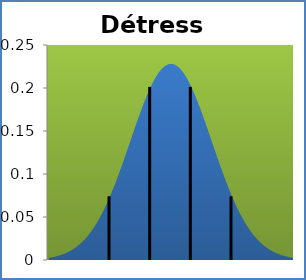
| Category | Series 1 |
|---|---|
| -2.2840000000000007 | 0.003 |
| -2.1965500000000002 | 0.003 |
| -2.1091000000000006 | 0.003 |
| -2.02165 | 0.004 |
| -1.9341999999999997 | 0.005 |
| -1.8467500000000001 | 0.005 |
| -1.7593000000000005 | 0.006 |
| -1.67185 | 0.007 |
| -1.5844000000000005 | 0.008 |
| -1.496950000000001 | 0.009 |
| -1.4095000000000004 | 0.01 |
| -1.32205 | 0.011 |
| -1.2345999999999995 | 0.013 |
| -1.14715 | 0.014 |
| -1.0597000000000003 | 0.016 |
| -0.9722499999999998 | 0.018 |
| -0.8848000000000003 | 0.02 |
| -0.7973500000000002 | 0.023 |
| -0.7098999999999998 | 0.025 |
| -0.6224500000000002 | 0.028 |
| -0.5350000000000001 | 0.031 |
| -0.44754999999999967 | 0.034 |
| -0.3601000000000001 | 0.038 |
| -0.2726500000000005 | 0.041 |
| -0.18520000000000003 | 0.045 |
| -0.09775 | 0.049 |
| -0.010299999999999976 | 0.054 |
| 0.07714999999999961 | 0.058 |
| 0.16460000000000008 | 0.063 |
| 0.2520500000000001 | 0.069 |
| 0.3394999999999997 | 0.074 |
| 0.4269499999999997 | 0.08 |
| 0.5144000000000002 | 0.086 |
| 0.6018499999999998 | 0.092 |
| 0.6892999999999998 | 0.098 |
| 0.7767499999999998 | 0.104 |
| 0.8642000000000003 | 0.111 |
| 0.9516499999999999 | 0.118 |
| 1.0391 | 0.125 |
| 1.1265500000000002 | 0.131 |
| 1.214 | 0.138 |
| 1.30145 | 0.145 |
| 1.3889 | 0.152 |
| 1.47635 | 0.159 |
| 1.5638 | 0.166 |
| 1.6512499999999999 | 0.172 |
| 1.7387000000000001 | 0.179 |
| 1.82615 | 0.185 |
| 1.9136000000000002 | 0.191 |
| 2.00105 | 0.196 |
| 2.0885 | 0.201 |
| 2.1759500000000003 | 0.206 |
| 2.2634 | 0.211 |
| 2.3508500000000003 | 0.215 |
| 2.4383 | 0.218 |
| 2.52575 | 0.221 |
| 2.6132 | 0.224 |
| 2.70065 | 0.226 |
| 2.7881 | 0.227 |
| 2.87555 | 0.228 |
| 2.963 | 0.228 |
| 3.05045 | 0.228 |
| 3.1379 | 0.227 |
| 3.22535 | 0.226 |
| 3.3128 | 0.224 |
| 3.40025 | 0.221 |
| 3.4877000000000002 | 0.218 |
| 3.57515 | 0.215 |
| 3.6626000000000003 | 0.211 |
| 3.75005 | 0.206 |
| 3.8375000000000004 | 0.201 |
| 3.92495 | 0.196 |
| 4.0123999999999995 | 0.191 |
| 4.09985 | 0.185 |
| 4.1873000000000005 | 0.179 |
| 4.27475 | 0.172 |
| 4.3622 | 0.166 |
| 4.44965 | 0.159 |
| 4.537100000000001 | 0.152 |
| 4.62455 | 0.145 |
| 4.712 | 0.138 |
| 4.79945 | 0.131 |
| 4.886900000000001 | 0.125 |
| 4.97435 | 0.118 |
| 5.0618 | 0.111 |
| 5.14925 | 0.104 |
| 5.236700000000001 | 0.098 |
| 5.32415 | 0.092 |
| 5.4116 | 0.086 |
| 5.49905 | 0.08 |
| 5.586500000000001 | 0.074 |
| 5.67395 | 0.069 |
| 5.7614 | 0.063 |
| 5.8488500000000005 | 0.058 |
| 5.9363 | 0.054 |
| 6.02375 | 0.049 |
| 6.1112 | 0.045 |
| 6.198650000000001 | 0.041 |
| 6.2861 | 0.038 |
| 6.37355 | 0.034 |
| 6.461 | 0.031 |
| 6.548450000000001 | 0.028 |
| 6.6358999999999995 | 0.025 |
| 6.72335 | 0.023 |
| 6.8108 | 0.02 |
| 6.89825 | 0.018 |
| 6.9857000000000005 | 0.016 |
| 7.07315 | 0.014 |
| 7.1606 | 0.013 |
| 7.24805 | 0.011 |
| 7.335500000000001 | 0.01 |
| 7.422950000000001 | 0.009 |
| 7.510400000000001 | 0.008 |
| 7.59785 | 0.007 |
| 7.685300000000001 | 0.006 |
| 7.77275 | 0.005 |
| 7.8602 | 0.005 |
| 7.94765 | 0.004 |
| 8.0351 | 0.003 |
| 8.12255 | 0.003 |
| 8.21 | 0.003 |